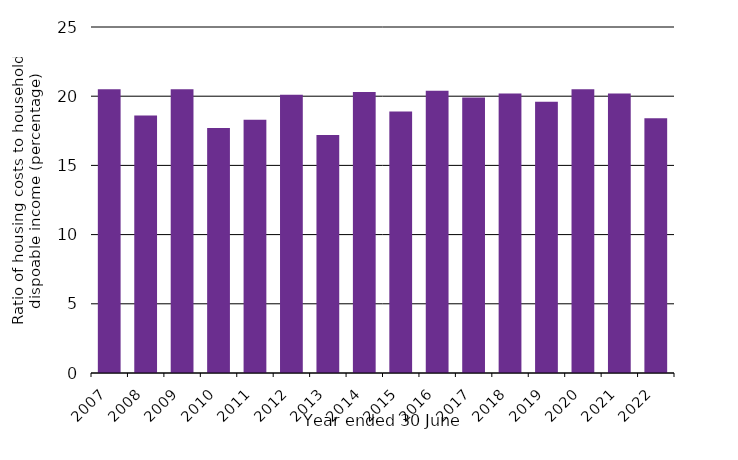
| Category | Ratio of housing costs to household disposable income (percentage) |
|---|---|
| 2007.0 | 20.5 |
| 2008.0 | 18.6 |
| 2009.0 | 20.5 |
| 2010.0 | 17.7 |
| 2011.0 | 18.3 |
| 2012.0 | 20.1 |
| 2013.0 | 17.2 |
| 2014.0 | 20.3 |
| 2015.0 | 18.9 |
| 2016.0 | 20.4 |
| 2017.0 | 19.9 |
| 2018.0 | 20.2 |
| 2019.0 | 19.6 |
| 2020.0 | 20.5 |
| 2021.0 | 20.2 |
| 2022.0 | 18.4 |